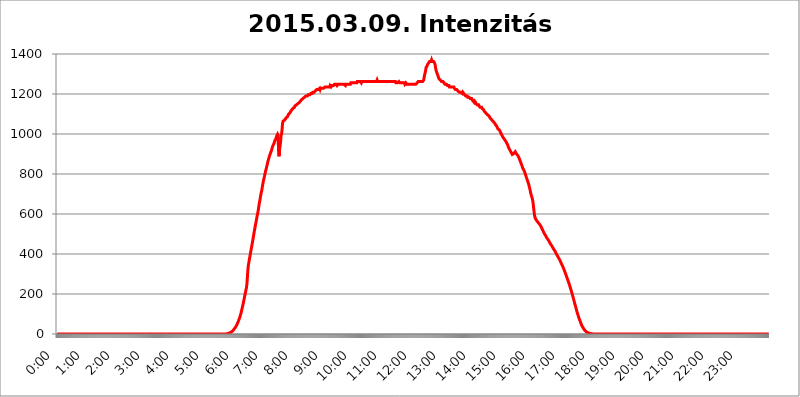
| Category | 2015.03.09. Intenzitás [W/m^2] |
|---|---|
| 0.0 | -0.256 |
| 0.0006944444444444445 | -0.256 |
| 0.001388888888888889 | -0.256 |
| 0.0020833333333333333 | -0.256 |
| 0.002777777777777778 | -0.256 |
| 0.003472222222222222 | -0.256 |
| 0.004166666666666667 | -0.256 |
| 0.004861111111111111 | -0.256 |
| 0.005555555555555556 | -0.256 |
| 0.0062499999999999995 | -0.256 |
| 0.006944444444444444 | -0.256 |
| 0.007638888888888889 | -0.256 |
| 0.008333333333333333 | -0.256 |
| 0.009027777777777779 | -0.256 |
| 0.009722222222222222 | -0.256 |
| 0.010416666666666666 | -0.256 |
| 0.011111111111111112 | -0.256 |
| 0.011805555555555555 | -0.256 |
| 0.012499999999999999 | -0.256 |
| 0.013194444444444444 | -0.256 |
| 0.013888888888888888 | -0.256 |
| 0.014583333333333332 | -0.256 |
| 0.015277777777777777 | -0.256 |
| 0.015972222222222224 | -0.256 |
| 0.016666666666666666 | -0.256 |
| 0.017361111111111112 | -0.256 |
| 0.018055555555555557 | -0.256 |
| 0.01875 | -0.256 |
| 0.019444444444444445 | -0.256 |
| 0.02013888888888889 | -0.256 |
| 0.020833333333333332 | -0.256 |
| 0.02152777777777778 | -0.256 |
| 0.022222222222222223 | -0.256 |
| 0.02291666666666667 | -0.256 |
| 0.02361111111111111 | -0.256 |
| 0.024305555555555556 | -0.256 |
| 0.024999999999999998 | -0.256 |
| 0.025694444444444447 | -0.256 |
| 0.02638888888888889 | -0.256 |
| 0.027083333333333334 | -0.256 |
| 0.027777777777777776 | -0.256 |
| 0.02847222222222222 | -0.256 |
| 0.029166666666666664 | -0.256 |
| 0.029861111111111113 | -0.256 |
| 0.030555555555555555 | -0.256 |
| 0.03125 | -0.256 |
| 0.03194444444444445 | -0.256 |
| 0.03263888888888889 | -0.256 |
| 0.03333333333333333 | -0.256 |
| 0.034027777777777775 | -0.256 |
| 0.034722222222222224 | -0.256 |
| 0.035416666666666666 | -0.256 |
| 0.036111111111111115 | -0.256 |
| 0.03680555555555556 | -0.256 |
| 0.0375 | -0.256 |
| 0.03819444444444444 | -0.256 |
| 0.03888888888888889 | -0.256 |
| 0.03958333333333333 | -0.256 |
| 0.04027777777777778 | -0.256 |
| 0.04097222222222222 | -0.256 |
| 0.041666666666666664 | -0.256 |
| 0.042361111111111106 | -0.256 |
| 0.04305555555555556 | -0.256 |
| 0.043750000000000004 | -0.256 |
| 0.044444444444444446 | -0.256 |
| 0.04513888888888889 | -0.256 |
| 0.04583333333333334 | -0.256 |
| 0.04652777777777778 | -0.256 |
| 0.04722222222222222 | -0.256 |
| 0.04791666666666666 | -0.256 |
| 0.04861111111111111 | -0.256 |
| 0.049305555555555554 | -0.256 |
| 0.049999999999999996 | -0.256 |
| 0.05069444444444445 | -0.256 |
| 0.051388888888888894 | -0.256 |
| 0.052083333333333336 | -0.256 |
| 0.05277777777777778 | -0.256 |
| 0.05347222222222222 | -0.256 |
| 0.05416666666666667 | -0.256 |
| 0.05486111111111111 | -0.256 |
| 0.05555555555555555 | -0.256 |
| 0.05625 | -0.256 |
| 0.05694444444444444 | -0.256 |
| 0.057638888888888885 | -0.256 |
| 0.05833333333333333 | -0.256 |
| 0.05902777777777778 | -0.256 |
| 0.059722222222222225 | -0.256 |
| 0.06041666666666667 | -0.256 |
| 0.061111111111111116 | -0.256 |
| 0.06180555555555556 | -0.256 |
| 0.0625 | -0.256 |
| 0.06319444444444444 | -0.256 |
| 0.06388888888888888 | -0.256 |
| 0.06458333333333334 | -0.256 |
| 0.06527777777777778 | -0.256 |
| 0.06597222222222222 | -0.256 |
| 0.06666666666666667 | -0.256 |
| 0.06736111111111111 | -0.256 |
| 0.06805555555555555 | -0.256 |
| 0.06874999999999999 | -0.256 |
| 0.06944444444444443 | -0.256 |
| 0.07013888888888889 | -0.256 |
| 0.07083333333333333 | -0.256 |
| 0.07152777777777779 | -0.256 |
| 0.07222222222222223 | -0.256 |
| 0.07291666666666667 | -0.256 |
| 0.07361111111111111 | -0.256 |
| 0.07430555555555556 | -0.256 |
| 0.075 | -0.256 |
| 0.07569444444444444 | -0.256 |
| 0.0763888888888889 | -0.256 |
| 0.07708333333333334 | -0.256 |
| 0.07777777777777778 | -0.256 |
| 0.07847222222222222 | -0.256 |
| 0.07916666666666666 | -0.256 |
| 0.0798611111111111 | -0.256 |
| 0.08055555555555556 | -0.256 |
| 0.08125 | -0.256 |
| 0.08194444444444444 | -0.256 |
| 0.08263888888888889 | -0.256 |
| 0.08333333333333333 | -0.256 |
| 0.08402777777777777 | -0.256 |
| 0.08472222222222221 | -0.256 |
| 0.08541666666666665 | -0.256 |
| 0.08611111111111112 | -0.256 |
| 0.08680555555555557 | -0.256 |
| 0.08750000000000001 | -0.256 |
| 0.08819444444444445 | -0.256 |
| 0.08888888888888889 | -0.256 |
| 0.08958333333333333 | -0.256 |
| 0.09027777777777778 | -0.256 |
| 0.09097222222222222 | -0.256 |
| 0.09166666666666667 | -0.256 |
| 0.09236111111111112 | -0.256 |
| 0.09305555555555556 | -0.256 |
| 0.09375 | -0.256 |
| 0.09444444444444444 | -0.256 |
| 0.09513888888888888 | -0.256 |
| 0.09583333333333333 | -0.256 |
| 0.09652777777777777 | -0.256 |
| 0.09722222222222222 | -0.256 |
| 0.09791666666666667 | -0.256 |
| 0.09861111111111111 | -0.256 |
| 0.09930555555555555 | -0.256 |
| 0.09999999999999999 | -0.256 |
| 0.10069444444444443 | -0.256 |
| 0.1013888888888889 | -0.256 |
| 0.10208333333333335 | -0.256 |
| 0.10277777777777779 | -0.256 |
| 0.10347222222222223 | -0.256 |
| 0.10416666666666667 | -0.256 |
| 0.10486111111111111 | -0.256 |
| 0.10555555555555556 | -0.256 |
| 0.10625 | -0.256 |
| 0.10694444444444444 | -0.256 |
| 0.1076388888888889 | -0.256 |
| 0.10833333333333334 | -0.256 |
| 0.10902777777777778 | -0.256 |
| 0.10972222222222222 | -0.256 |
| 0.1111111111111111 | -0.256 |
| 0.11180555555555556 | -0.256 |
| 0.11180555555555556 | -0.256 |
| 0.1125 | -0.256 |
| 0.11319444444444444 | -0.256 |
| 0.11388888888888889 | -0.256 |
| 0.11458333333333333 | -0.256 |
| 0.11527777777777777 | -0.256 |
| 0.11597222222222221 | -0.256 |
| 0.11666666666666665 | -0.256 |
| 0.1173611111111111 | -0.256 |
| 0.11805555555555557 | -0.256 |
| 0.11944444444444445 | -0.256 |
| 0.12013888888888889 | -0.256 |
| 0.12083333333333333 | -0.256 |
| 0.12152777777777778 | -0.256 |
| 0.12222222222222223 | -0.256 |
| 0.12291666666666667 | -0.256 |
| 0.12291666666666667 | -0.256 |
| 0.12361111111111112 | -0.256 |
| 0.12430555555555556 | -0.256 |
| 0.125 | -0.256 |
| 0.12569444444444444 | -0.256 |
| 0.12638888888888888 | -0.256 |
| 0.12708333333333333 | -0.256 |
| 0.16875 | -0.256 |
| 0.12847222222222224 | -0.256 |
| 0.12916666666666668 | -0.256 |
| 0.12986111111111112 | -0.256 |
| 0.13055555555555556 | -0.256 |
| 0.13125 | -0.256 |
| 0.13194444444444445 | -0.256 |
| 0.1326388888888889 | -0.256 |
| 0.13333333333333333 | -0.256 |
| 0.13402777777777777 | -0.256 |
| 0.13402777777777777 | -0.256 |
| 0.13472222222222222 | -0.256 |
| 0.13541666666666666 | -0.256 |
| 0.1361111111111111 | -0.256 |
| 0.13749999999999998 | -0.256 |
| 0.13819444444444443 | -0.256 |
| 0.1388888888888889 | -0.256 |
| 0.13958333333333334 | -0.256 |
| 0.14027777777777778 | -0.256 |
| 0.14097222222222222 | -0.256 |
| 0.14166666666666666 | -0.256 |
| 0.1423611111111111 | -0.256 |
| 0.14305555555555557 | -0.256 |
| 0.14375000000000002 | -0.256 |
| 0.14444444444444446 | -0.256 |
| 0.1451388888888889 | -0.256 |
| 0.1451388888888889 | -0.256 |
| 0.14652777777777778 | -0.256 |
| 0.14722222222222223 | -0.256 |
| 0.14791666666666667 | -0.256 |
| 0.1486111111111111 | -0.256 |
| 0.14930555555555555 | -0.256 |
| 0.15 | -0.256 |
| 0.15069444444444444 | -0.256 |
| 0.15138888888888888 | -0.256 |
| 0.15208333333333332 | -0.256 |
| 0.15277777777777776 | -0.256 |
| 0.15347222222222223 | -0.256 |
| 0.15416666666666667 | -0.256 |
| 0.15486111111111112 | -0.256 |
| 0.15555555555555556 | -0.256 |
| 0.15625 | -0.256 |
| 0.15694444444444444 | -0.256 |
| 0.15763888888888888 | -0.256 |
| 0.15833333333333333 | -0.256 |
| 0.15902777777777777 | -0.256 |
| 0.15972222222222224 | -0.256 |
| 0.16041666666666668 | -0.256 |
| 0.16111111111111112 | -0.256 |
| 0.16180555555555556 | -0.256 |
| 0.1625 | -0.256 |
| 0.16319444444444445 | -0.256 |
| 0.1638888888888889 | -0.256 |
| 0.16458333333333333 | -0.256 |
| 0.16527777777777777 | -0.256 |
| 0.16597222222222222 | -0.256 |
| 0.16666666666666666 | -0.256 |
| 0.1673611111111111 | -0.256 |
| 0.16805555555555554 | -0.256 |
| 0.16874999999999998 | -0.256 |
| 0.16944444444444443 | -0.256 |
| 0.17013888888888887 | -0.256 |
| 0.1708333333333333 | -0.256 |
| 0.17152777777777775 | -0.256 |
| 0.17222222222222225 | -0.256 |
| 0.1729166666666667 | -0.256 |
| 0.17361111111111113 | -0.256 |
| 0.17430555555555557 | -0.256 |
| 0.17500000000000002 | -0.256 |
| 0.17569444444444446 | -0.256 |
| 0.1763888888888889 | -0.256 |
| 0.17708333333333334 | -0.256 |
| 0.17777777777777778 | -0.256 |
| 0.17847222222222223 | -0.256 |
| 0.17916666666666667 | -0.256 |
| 0.1798611111111111 | -0.256 |
| 0.18055555555555555 | -0.256 |
| 0.18125 | -0.256 |
| 0.18194444444444444 | -0.256 |
| 0.1826388888888889 | -0.256 |
| 0.18333333333333335 | -0.256 |
| 0.1840277777777778 | -0.256 |
| 0.18472222222222223 | -0.256 |
| 0.18541666666666667 | -0.256 |
| 0.18611111111111112 | -0.256 |
| 0.18680555555555556 | -0.256 |
| 0.1875 | -0.256 |
| 0.18819444444444444 | -0.256 |
| 0.18888888888888888 | -0.256 |
| 0.18958333333333333 | -0.256 |
| 0.19027777777777777 | -0.256 |
| 0.1909722222222222 | -0.256 |
| 0.19166666666666665 | -0.256 |
| 0.19236111111111112 | -0.256 |
| 0.19305555555555554 | -0.256 |
| 0.19375 | -0.256 |
| 0.19444444444444445 | -0.256 |
| 0.1951388888888889 | -0.256 |
| 0.19583333333333333 | -0.256 |
| 0.19652777777777777 | -0.256 |
| 0.19722222222222222 | -0.256 |
| 0.19791666666666666 | -0.256 |
| 0.1986111111111111 | -0.256 |
| 0.19930555555555554 | -0.256 |
| 0.19999999999999998 | -0.256 |
| 0.20069444444444443 | -0.256 |
| 0.20138888888888887 | -0.256 |
| 0.2020833333333333 | -0.256 |
| 0.2027777777777778 | -0.256 |
| 0.2034722222222222 | -0.256 |
| 0.2041666666666667 | -0.256 |
| 0.20486111111111113 | -0.256 |
| 0.20555555555555557 | -0.256 |
| 0.20625000000000002 | -0.256 |
| 0.20694444444444446 | -0.256 |
| 0.2076388888888889 | -0.256 |
| 0.20833333333333334 | -0.256 |
| 0.20902777777777778 | -0.256 |
| 0.20972222222222223 | -0.256 |
| 0.21041666666666667 | -0.256 |
| 0.2111111111111111 | -0.256 |
| 0.21180555555555555 | -0.256 |
| 0.2125 | -0.256 |
| 0.21319444444444444 | -0.256 |
| 0.2138888888888889 | -0.256 |
| 0.21458333333333335 | -0.256 |
| 0.2152777777777778 | -0.256 |
| 0.21597222222222223 | -0.256 |
| 0.21666666666666667 | -0.256 |
| 0.21736111111111112 | -0.256 |
| 0.21805555555555556 | -0.256 |
| 0.21875 | -0.256 |
| 0.21944444444444444 | -0.256 |
| 0.22013888888888888 | -0.256 |
| 0.22083333333333333 | -0.256 |
| 0.22152777777777777 | -0.256 |
| 0.2222222222222222 | -0.256 |
| 0.22291666666666665 | -0.256 |
| 0.2236111111111111 | -0.256 |
| 0.22430555555555556 | -0.256 |
| 0.225 | -0.256 |
| 0.22569444444444445 | -0.256 |
| 0.2263888888888889 | -0.256 |
| 0.22708333333333333 | -0.256 |
| 0.22777777777777777 | -0.256 |
| 0.22847222222222222 | -0.256 |
| 0.22916666666666666 | -0.256 |
| 0.2298611111111111 | -0.256 |
| 0.23055555555555554 | -0.256 |
| 0.23124999999999998 | -0.256 |
| 0.23194444444444443 | -0.256 |
| 0.23263888888888887 | -0.256 |
| 0.2333333333333333 | -0.256 |
| 0.2340277777777778 | -0.256 |
| 0.2347222222222222 | -0.256 |
| 0.2354166666666667 | -0.256 |
| 0.23611111111111113 | -0.256 |
| 0.23680555555555557 | 1.09 |
| 0.23750000000000002 | 1.09 |
| 0.23819444444444446 | 1.09 |
| 0.2388888888888889 | 1.09 |
| 0.23958333333333334 | 2.439 |
| 0.24027777777777778 | 2.439 |
| 0.24097222222222223 | 3.791 |
| 0.24166666666666667 | 5.146 |
| 0.2423611111111111 | 6.503 |
| 0.24305555555555555 | 6.503 |
| 0.24375 | 9.225 |
| 0.24444444444444446 | 10.589 |
| 0.24513888888888888 | 11.956 |
| 0.24583333333333335 | 14.696 |
| 0.2465277777777778 | 17.444 |
| 0.24722222222222223 | 20.201 |
| 0.24791666666666667 | 22.965 |
| 0.24861111111111112 | 27.124 |
| 0.24930555555555556 | 29.905 |
| 0.25 | 34.086 |
| 0.25069444444444444 | 38.28 |
| 0.2513888888888889 | 42.483 |
| 0.2520833333333333 | 48.1 |
| 0.25277777777777777 | 53.73 |
| 0.2534722222222222 | 59.368 |
| 0.25416666666666665 | 65.012 |
| 0.2548611111111111 | 72.069 |
| 0.2555555555555556 | 79.125 |
| 0.25625000000000003 | 86.175 |
| 0.2569444444444445 | 94.617 |
| 0.2576388888888889 | 103.035 |
| 0.25833333333333336 | 114.207 |
| 0.2590277777777778 | 123.922 |
| 0.25972222222222224 | 134.943 |
| 0.2604166666666667 | 145.865 |
| 0.2611111111111111 | 158.022 |
| 0.26180555555555557 | 170.029 |
| 0.2625 | 181.877 |
| 0.26319444444444445 | 194.849 |
| 0.2638888888888889 | 206.348 |
| 0.26458333333333334 | 218.93 |
| 0.2652777777777778 | 230.083 |
| 0.2659722222222222 | 248.335 |
| 0.26666666666666666 | 283.803 |
| 0.2673611111111111 | 320.84 |
| 0.26805555555555555 | 344.144 |
| 0.26875 | 358.394 |
| 0.26944444444444443 | 372.972 |
| 0.2701388888888889 | 386.723 |
| 0.2708333333333333 | 400.943 |
| 0.27152777777777776 | 414.364 |
| 0.2722222222222222 | 428.341 |
| 0.27291666666666664 | 441.469 |
| 0.2736111111111111 | 455.184 |
| 0.2743055555555555 | 469.557 |
| 0.27499999999999997 | 484.662 |
| 0.27569444444444446 | 498.764 |
| 0.27638888888888885 | 513.561 |
| 0.27708333333333335 | 527.122 |
| 0.2777777777777778 | 541.298 |
| 0.27847222222222223 | 553.97 |
| 0.2791666666666667 | 567.15 |
| 0.2798611111111111 | 580.866 |
| 0.28055555555555556 | 595.145 |
| 0.28125 | 604.992 |
| 0.28194444444444444 | 620.273 |
| 0.2826388888888889 | 636.194 |
| 0.2833333333333333 | 652.786 |
| 0.28402777777777777 | 664.234 |
| 0.2847222222222222 | 678.997 |
| 0.28541666666666665 | 694.278 |
| 0.28611111111111115 | 706.89 |
| 0.28680555555555554 | 716.58 |
| 0.28750000000000003 | 733.184 |
| 0.2881944444444445 | 746.886 |
| 0.2888888888888889 | 760.972 |
| 0.28958333333333336 | 771.794 |
| 0.2902777777777778 | 782.842 |
| 0.29097222222222224 | 794.119 |
| 0.2916666666666667 | 805.632 |
| 0.2923611111111111 | 817.382 |
| 0.29305555555555557 | 825.351 |
| 0.29375 | 837.51 |
| 0.29444444444444445 | 845.755 |
| 0.2951388888888889 | 858.335 |
| 0.29583333333333334 | 862.585 |
| 0.2965277777777778 | 875.511 |
| 0.2972222222222222 | 884.274 |
| 0.29791666666666666 | 893.157 |
| 0.2986111111111111 | 897.643 |
| 0.29930555555555555 | 906.707 |
| 0.3 | 911.285 |
| 0.30069444444444443 | 920.533 |
| 0.3013888888888889 | 929.905 |
| 0.3020833333333333 | 934.639 |
| 0.30277777777777776 | 944.201 |
| 0.3034722222222222 | 949.03 |
| 0.30416666666666664 | 953.892 |
| 0.3048611111111111 | 963.712 |
| 0.3055555555555555 | 968.671 |
| 0.30624999999999997 | 973.663 |
| 0.3069444444444444 | 978.688 |
| 0.3076388888888889 | 988.839 |
| 0.30833333333333335 | 993.965 |
| 0.3090277777777778 | 999.125 |
| 0.30972222222222223 | 993.965 |
| 0.3104166666666667 | 915.893 |
| 0.3111111111111111 | 888.701 |
| 0.31180555555555556 | 920.533 |
| 0.3125 | 920.533 |
| 0.31319444444444444 | 958.785 |
| 0.3138888888888889 | 993.965 |
| 0.3145833333333333 | 999.125 |
| 0.31527777777777777 | 1020.106 |
| 0.3159722222222222 | 1052.625 |
| 0.31666666666666665 | 1063.751 |
| 0.31736111111111115 | 1063.751 |
| 0.31805555555555554 | 1063.751 |
| 0.31875000000000003 | 1069.368 |
| 0.3194444444444445 | 1069.368 |
| 0.3201388888888889 | 1075.021 |
| 0.32083333333333336 | 1080.711 |
| 0.3215277777777778 | 1080.711 |
| 0.32222222222222224 | 1080.711 |
| 0.3229166666666667 | 1086.439 |
| 0.3236111111111111 | 1092.203 |
| 0.32430555555555557 | 1098.004 |
| 0.325 | 1098.004 |
| 0.32569444444444445 | 1103.843 |
| 0.3263888888888889 | 1103.843 |
| 0.32708333333333334 | 1109.72 |
| 0.3277777777777778 | 1115.634 |
| 0.3284722222222222 | 1115.634 |
| 0.32916666666666666 | 1121.587 |
| 0.3298611111111111 | 1121.587 |
| 0.33055555555555555 | 1127.578 |
| 0.33125 | 1127.578 |
| 0.33194444444444443 | 1127.578 |
| 0.3326388888888889 | 1133.607 |
| 0.3333333333333333 | 1139.675 |
| 0.3340277777777778 | 1139.675 |
| 0.3347222222222222 | 1139.675 |
| 0.3354166666666667 | 1145.782 |
| 0.3361111111111111 | 1145.782 |
| 0.3368055555555556 | 1145.782 |
| 0.33749999999999997 | 1151.928 |
| 0.33819444444444446 | 1151.928 |
| 0.33888888888888885 | 1151.928 |
| 0.33958333333333335 | 1158.113 |
| 0.34027777777777773 | 1158.113 |
| 0.34097222222222223 | 1164.337 |
| 0.3416666666666666 | 1164.337 |
| 0.3423611111111111 | 1170.601 |
| 0.3430555555555555 | 1170.601 |
| 0.34375 | 1170.601 |
| 0.3444444444444445 | 1176.905 |
| 0.3451388888888889 | 1176.905 |
| 0.3458333333333334 | 1176.905 |
| 0.34652777777777777 | 1183.249 |
| 0.34722222222222227 | 1183.249 |
| 0.34791666666666665 | 1183.249 |
| 0.34861111111111115 | 1189.633 |
| 0.34930555555555554 | 1189.633 |
| 0.35000000000000003 | 1189.633 |
| 0.3506944444444444 | 1189.633 |
| 0.3513888888888889 | 1189.633 |
| 0.3520833333333333 | 1196.058 |
| 0.3527777777777778 | 1196.058 |
| 0.3534722222222222 | 1196.058 |
| 0.3541666666666667 | 1196.058 |
| 0.3548611111111111 | 1196.058 |
| 0.35555555555555557 | 1202.523 |
| 0.35625 | 1202.523 |
| 0.35694444444444445 | 1202.523 |
| 0.3576388888888889 | 1202.523 |
| 0.35833333333333334 | 1209.029 |
| 0.3590277777777778 | 1209.029 |
| 0.3597222222222222 | 1209.029 |
| 0.36041666666666666 | 1209.029 |
| 0.3611111111111111 | 1209.029 |
| 0.36180555555555555 | 1215.576 |
| 0.3625 | 1215.576 |
| 0.36319444444444443 | 1215.576 |
| 0.3638888888888889 | 1222.164 |
| 0.3645833333333333 | 1222.164 |
| 0.3652777777777778 | 1222.164 |
| 0.3659722222222222 | 1222.164 |
| 0.3666666666666667 | 1222.164 |
| 0.3673611111111111 | 1222.164 |
| 0.3680555555555556 | 1228.794 |
| 0.36874999999999997 | 1222.164 |
| 0.36944444444444446 | 1228.794 |
| 0.37013888888888885 | 1228.794 |
| 0.37083333333333335 | 1228.794 |
| 0.37152777777777773 | 1228.794 |
| 0.37222222222222223 | 1228.794 |
| 0.3729166666666666 | 1228.794 |
| 0.3736111111111111 | 1228.794 |
| 0.3743055555555555 | 1228.794 |
| 0.375 | 1228.794 |
| 0.3756944444444445 | 1235.465 |
| 0.3763888888888889 | 1235.465 |
| 0.3770833333333334 | 1235.465 |
| 0.37777777777777777 | 1235.465 |
| 0.37847222222222227 | 1235.465 |
| 0.37916666666666665 | 1235.465 |
| 0.37986111111111115 | 1235.465 |
| 0.38055555555555554 | 1235.465 |
| 0.38125000000000003 | 1235.465 |
| 0.3819444444444444 | 1235.465 |
| 0.3826388888888889 | 1242.179 |
| 0.3833333333333333 | 1242.179 |
| 0.3840277777777778 | 1235.465 |
| 0.3847222222222222 | 1235.465 |
| 0.3854166666666667 | 1242.179 |
| 0.3861111111111111 | 1242.179 |
| 0.38680555555555557 | 1242.179 |
| 0.3875 | 1242.179 |
| 0.38819444444444445 | 1242.179 |
| 0.3888888888888889 | 1248.934 |
| 0.38958333333333334 | 1248.934 |
| 0.3902777777777778 | 1248.934 |
| 0.3909722222222222 | 1248.934 |
| 0.39166666666666666 | 1248.934 |
| 0.3923611111111111 | 1242.179 |
| 0.39305555555555555 | 1242.179 |
| 0.39375 | 1248.934 |
| 0.39444444444444443 | 1248.934 |
| 0.3951388888888889 | 1248.934 |
| 0.3958333333333333 | 1248.934 |
| 0.3965277777777778 | 1248.934 |
| 0.3972222222222222 | 1248.934 |
| 0.3979166666666667 | 1248.934 |
| 0.3986111111111111 | 1248.934 |
| 0.3993055555555556 | 1248.934 |
| 0.39999999999999997 | 1248.934 |
| 0.40069444444444446 | 1248.934 |
| 0.40138888888888885 | 1248.934 |
| 0.40208333333333335 | 1248.934 |
| 0.40277777777777773 | 1248.934 |
| 0.40347222222222223 | 1248.934 |
| 0.4041666666666666 | 1242.179 |
| 0.4048611111111111 | 1248.934 |
| 0.4055555555555555 | 1248.934 |
| 0.40625 | 1248.934 |
| 0.4069444444444445 | 1248.934 |
| 0.4076388888888889 | 1248.934 |
| 0.4083333333333334 | 1248.934 |
| 0.40902777777777777 | 1248.934 |
| 0.40972222222222227 | 1248.934 |
| 0.41041666666666665 | 1248.934 |
| 0.41111111111111115 | 1248.934 |
| 0.41180555555555554 | 1255.731 |
| 0.41250000000000003 | 1255.731 |
| 0.4131944444444444 | 1255.731 |
| 0.4138888888888889 | 1255.731 |
| 0.4145833333333333 | 1255.731 |
| 0.4152777777777778 | 1255.731 |
| 0.4159722222222222 | 1255.731 |
| 0.4166666666666667 | 1255.731 |
| 0.4173611111111111 | 1255.731 |
| 0.41805555555555557 | 1255.731 |
| 0.41875 | 1255.731 |
| 0.41944444444444445 | 1255.731 |
| 0.4201388888888889 | 1255.731 |
| 0.42083333333333334 | 1262.571 |
| 0.4215277777777778 | 1262.571 |
| 0.4222222222222222 | 1262.571 |
| 0.42291666666666666 | 1262.571 |
| 0.4236111111111111 | 1262.571 |
| 0.42430555555555555 | 1262.571 |
| 0.425 | 1262.571 |
| 0.42569444444444443 | 1262.571 |
| 0.4263888888888889 | 1255.731 |
| 0.4270833333333333 | 1262.571 |
| 0.4277777777777778 | 1262.571 |
| 0.4284722222222222 | 1262.571 |
| 0.4291666666666667 | 1262.571 |
| 0.4298611111111111 | 1262.571 |
| 0.4305555555555556 | 1262.571 |
| 0.43124999999999997 | 1262.571 |
| 0.43194444444444446 | 1262.571 |
| 0.43263888888888885 | 1262.571 |
| 0.43333333333333335 | 1262.571 |
| 0.43402777777777773 | 1262.571 |
| 0.43472222222222223 | 1262.571 |
| 0.4354166666666666 | 1262.571 |
| 0.4361111111111111 | 1262.571 |
| 0.4368055555555555 | 1262.571 |
| 0.4375 | 1262.571 |
| 0.4381944444444445 | 1262.571 |
| 0.4388888888888889 | 1262.571 |
| 0.4395833333333334 | 1262.571 |
| 0.44027777777777777 | 1262.571 |
| 0.44097222222222227 | 1262.571 |
| 0.44166666666666665 | 1262.571 |
| 0.44236111111111115 | 1262.571 |
| 0.44305555555555554 | 1262.571 |
| 0.44375000000000003 | 1262.571 |
| 0.4444444444444444 | 1262.571 |
| 0.4451388888888889 | 1262.571 |
| 0.4458333333333333 | 1262.571 |
| 0.4465277777777778 | 1262.571 |
| 0.4472222222222222 | 1262.571 |
| 0.4479166666666667 | 1262.571 |
| 0.4486111111111111 | 1269.454 |
| 0.44930555555555557 | 1262.571 |
| 0.45 | 1262.571 |
| 0.45069444444444445 | 1262.571 |
| 0.4513888888888889 | 1262.571 |
| 0.45208333333333334 | 1262.571 |
| 0.4527777777777778 | 1262.571 |
| 0.4534722222222222 | 1262.571 |
| 0.45416666666666666 | 1262.571 |
| 0.4548611111111111 | 1262.571 |
| 0.45555555555555555 | 1262.571 |
| 0.45625 | 1262.571 |
| 0.45694444444444443 | 1262.571 |
| 0.4576388888888889 | 1262.571 |
| 0.4583333333333333 | 1262.571 |
| 0.4590277777777778 | 1262.571 |
| 0.4597222222222222 | 1262.571 |
| 0.4604166666666667 | 1262.571 |
| 0.4611111111111111 | 1262.571 |
| 0.4618055555555556 | 1262.571 |
| 0.46249999999999997 | 1262.571 |
| 0.46319444444444446 | 1262.571 |
| 0.46388888888888885 | 1262.571 |
| 0.46458333333333335 | 1262.571 |
| 0.46527777777777773 | 1262.571 |
| 0.46597222222222223 | 1262.571 |
| 0.4666666666666666 | 1262.571 |
| 0.4673611111111111 | 1262.571 |
| 0.4680555555555555 | 1262.571 |
| 0.46875 | 1262.571 |
| 0.4694444444444445 | 1262.571 |
| 0.4701388888888889 | 1262.571 |
| 0.4708333333333334 | 1262.571 |
| 0.47152777777777777 | 1262.571 |
| 0.47222222222222227 | 1262.571 |
| 0.47291666666666665 | 1262.571 |
| 0.47361111111111115 | 1262.571 |
| 0.47430555555555554 | 1262.571 |
| 0.47500000000000003 | 1255.731 |
| 0.4756944444444444 | 1255.731 |
| 0.4763888888888889 | 1255.731 |
| 0.4770833333333333 | 1255.731 |
| 0.4777777777777778 | 1255.731 |
| 0.4784722222222222 | 1255.731 |
| 0.4791666666666667 | 1262.571 |
| 0.4798611111111111 | 1262.571 |
| 0.48055555555555557 | 1255.731 |
| 0.48125 | 1255.731 |
| 0.48194444444444445 | 1255.731 |
| 0.4826388888888889 | 1255.731 |
| 0.48333333333333334 | 1255.731 |
| 0.4840277777777778 | 1255.731 |
| 0.4847222222222222 | 1255.731 |
| 0.48541666666666666 | 1255.731 |
| 0.4861111111111111 | 1255.731 |
| 0.48680555555555555 | 1255.731 |
| 0.4875 | 1248.934 |
| 0.48819444444444443 | 1248.934 |
| 0.4888888888888889 | 1255.731 |
| 0.4895833333333333 | 1255.731 |
| 0.4902777777777778 | 1248.934 |
| 0.4909722222222222 | 1248.934 |
| 0.4916666666666667 | 1248.934 |
| 0.4923611111111111 | 1248.934 |
| 0.4930555555555556 | 1248.934 |
| 0.49374999999999997 | 1248.934 |
| 0.49444444444444446 | 1248.934 |
| 0.49513888888888885 | 1248.934 |
| 0.49583333333333335 | 1248.934 |
| 0.49652777777777773 | 1248.934 |
| 0.49722222222222223 | 1248.934 |
| 0.4979166666666666 | 1248.934 |
| 0.4986111111111111 | 1248.934 |
| 0.4993055555555555 | 1248.934 |
| 0.5 | 1248.934 |
| 0.5006944444444444 | 1248.934 |
| 0.5013888888888889 | 1248.934 |
| 0.5020833333333333 | 1248.934 |
| 0.5027777777777778 | 1248.934 |
| 0.5034722222222222 | 1248.934 |
| 0.5041666666666667 | 1248.934 |
| 0.5048611111111111 | 1255.731 |
| 0.5055555555555555 | 1255.731 |
| 0.50625 | 1262.571 |
| 0.5069444444444444 | 1262.571 |
| 0.5076388888888889 | 1262.571 |
| 0.5083333333333333 | 1262.571 |
| 0.5090277777777777 | 1262.571 |
| 0.5097222222222222 | 1262.571 |
| 0.5104166666666666 | 1262.571 |
| 0.5111111111111112 | 1262.571 |
| 0.5118055555555555 | 1262.571 |
| 0.5125000000000001 | 1262.571 |
| 0.5131944444444444 | 1262.571 |
| 0.513888888888889 | 1269.454 |
| 0.5145833333333333 | 1283.348 |
| 0.5152777777777778 | 1297.416 |
| 0.5159722222222222 | 1304.515 |
| 0.5166666666666667 | 1318.845 |
| 0.517361111111111 | 1333.352 |
| 0.5180555555555556 | 1333.352 |
| 0.5187499999999999 | 1340.673 |
| 0.5194444444444445 | 1348.039 |
| 0.5201388888888888 | 1348.039 |
| 0.5208333333333334 | 1355.45 |
| 0.5215277777777778 | 1355.45 |
| 0.5222222222222223 | 1362.906 |
| 0.5229166666666667 | 1362.906 |
| 0.5236111111111111 | 1362.906 |
| 0.5243055555555556 | 1362.906 |
| 0.525 | 1370.408 |
| 0.5256944444444445 | 1362.906 |
| 0.5263888888888889 | 1362.906 |
| 0.5270833333333333 | 1362.906 |
| 0.5277777777777778 | 1362.906 |
| 0.5284722222222222 | 1362.906 |
| 0.5291666666666667 | 1355.45 |
| 0.5298611111111111 | 1348.039 |
| 0.5305555555555556 | 1333.352 |
| 0.53125 | 1318.845 |
| 0.5319444444444444 | 1311.658 |
| 0.5326388888888889 | 1304.515 |
| 0.5333333333333333 | 1297.416 |
| 0.5340277777777778 | 1290.36 |
| 0.5347222222222222 | 1283.348 |
| 0.5354166666666667 | 1276.38 |
| 0.5361111111111111 | 1276.38 |
| 0.5368055555555555 | 1276.38 |
| 0.5375 | 1269.454 |
| 0.5381944444444444 | 1269.454 |
| 0.5388888888888889 | 1262.571 |
| 0.5395833333333333 | 1262.571 |
| 0.5402777777777777 | 1262.571 |
| 0.5409722222222222 | 1262.571 |
| 0.5416666666666666 | 1262.571 |
| 0.5423611111111112 | 1255.731 |
| 0.5430555555555555 | 1255.731 |
| 0.5437500000000001 | 1248.934 |
| 0.5444444444444444 | 1248.934 |
| 0.545138888888889 | 1248.934 |
| 0.5458333333333333 | 1248.934 |
| 0.5465277777777778 | 1248.934 |
| 0.5472222222222222 | 1242.179 |
| 0.5479166666666667 | 1242.179 |
| 0.548611111111111 | 1242.179 |
| 0.5493055555555556 | 1242.179 |
| 0.5499999999999999 | 1235.465 |
| 0.5506944444444445 | 1235.465 |
| 0.5513888888888888 | 1235.465 |
| 0.5520833333333334 | 1235.465 |
| 0.5527777777777778 | 1235.465 |
| 0.5534722222222223 | 1235.465 |
| 0.5541666666666667 | 1235.465 |
| 0.5548611111111111 | 1235.465 |
| 0.5555555555555556 | 1235.465 |
| 0.55625 | 1235.465 |
| 0.5569444444444445 | 1228.794 |
| 0.5576388888888889 | 1228.794 |
| 0.5583333333333333 | 1222.164 |
| 0.5590277777777778 | 1222.164 |
| 0.5597222222222222 | 1222.164 |
| 0.5604166666666667 | 1222.164 |
| 0.5611111111111111 | 1222.164 |
| 0.5618055555555556 | 1215.576 |
| 0.5625 | 1215.576 |
| 0.5631944444444444 | 1215.576 |
| 0.5638888888888889 | 1209.029 |
| 0.5645833333333333 | 1209.029 |
| 0.5652777777777778 | 1209.029 |
| 0.5659722222222222 | 1209.029 |
| 0.5666666666666667 | 1209.029 |
| 0.5673611111111111 | 1209.029 |
| 0.5680555555555555 | 1202.523 |
| 0.56875 | 1209.029 |
| 0.5694444444444444 | 1209.029 |
| 0.5701388888888889 | 1202.523 |
| 0.5708333333333333 | 1202.523 |
| 0.5715277777777777 | 1196.058 |
| 0.5722222222222222 | 1196.058 |
| 0.5729166666666666 | 1189.633 |
| 0.5736111111111112 | 1189.633 |
| 0.5743055555555555 | 1189.633 |
| 0.5750000000000001 | 1189.633 |
| 0.5756944444444444 | 1183.249 |
| 0.576388888888889 | 1183.249 |
| 0.5770833333333333 | 1183.249 |
| 0.5777777777777778 | 1183.249 |
| 0.5784722222222222 | 1183.249 |
| 0.5791666666666667 | 1176.905 |
| 0.579861111111111 | 1176.905 |
| 0.5805555555555556 | 1176.905 |
| 0.5812499999999999 | 1176.905 |
| 0.5819444444444445 | 1170.601 |
| 0.5826388888888888 | 1170.601 |
| 0.5833333333333334 | 1164.337 |
| 0.5840277777777778 | 1164.337 |
| 0.5847222222222223 | 1158.113 |
| 0.5854166666666667 | 1164.337 |
| 0.5861111111111111 | 1164.337 |
| 0.5868055555555556 | 1158.113 |
| 0.5875 | 1151.928 |
| 0.5881944444444445 | 1151.928 |
| 0.5888888888888889 | 1145.782 |
| 0.5895833333333333 | 1145.782 |
| 0.5902777777777778 | 1145.782 |
| 0.5909722222222222 | 1145.782 |
| 0.5916666666666667 | 1139.675 |
| 0.5923611111111111 | 1139.675 |
| 0.5930555555555556 | 1133.607 |
| 0.59375 | 1133.607 |
| 0.5944444444444444 | 1133.607 |
| 0.5951388888888889 | 1133.607 |
| 0.5958333333333333 | 1127.578 |
| 0.5965277777777778 | 1127.578 |
| 0.5972222222222222 | 1127.578 |
| 0.5979166666666667 | 1121.587 |
| 0.5986111111111111 | 1115.634 |
| 0.5993055555555555 | 1115.634 |
| 0.6 | 1109.72 |
| 0.6006944444444444 | 1109.72 |
| 0.6013888888888889 | 1103.843 |
| 0.6020833333333333 | 1103.843 |
| 0.6027777777777777 | 1098.004 |
| 0.6034722222222222 | 1098.004 |
| 0.6041666666666666 | 1098.004 |
| 0.6048611111111112 | 1092.203 |
| 0.6055555555555555 | 1092.203 |
| 0.6062500000000001 | 1086.439 |
| 0.6069444444444444 | 1080.711 |
| 0.607638888888889 | 1080.711 |
| 0.6083333333333333 | 1075.021 |
| 0.6090277777777778 | 1075.021 |
| 0.6097222222222222 | 1069.368 |
| 0.6104166666666667 | 1069.368 |
| 0.611111111111111 | 1063.751 |
| 0.6118055555555556 | 1063.751 |
| 0.6124999999999999 | 1058.17 |
| 0.6131944444444445 | 1058.17 |
| 0.6138888888888888 | 1052.625 |
| 0.6145833333333334 | 1047.117 |
| 0.6152777777777778 | 1047.117 |
| 0.6159722222222223 | 1041.644 |
| 0.6166666666666667 | 1036.206 |
| 0.6173611111111111 | 1030.804 |
| 0.6180555555555556 | 1025.437 |
| 0.61875 | 1025.437 |
| 0.6194444444444445 | 1025.437 |
| 0.6201388888888889 | 1020.106 |
| 0.6208333333333333 | 1014.809 |
| 0.6215277777777778 | 1009.546 |
| 0.6222222222222222 | 1004.318 |
| 0.6229166666666667 | 999.125 |
| 0.6236111111111111 | 993.965 |
| 0.6243055555555556 | 988.839 |
| 0.625 | 983.747 |
| 0.6256944444444444 | 983.747 |
| 0.6263888888888889 | 978.688 |
| 0.6270833333333333 | 973.663 |
| 0.6277777777777778 | 973.663 |
| 0.6284722222222222 | 968.671 |
| 0.6291666666666667 | 963.712 |
| 0.6298611111111111 | 958.785 |
| 0.6305555555555555 | 953.892 |
| 0.63125 | 949.03 |
| 0.6319444444444444 | 944.201 |
| 0.6326388888888889 | 934.639 |
| 0.6333333333333333 | 929.905 |
| 0.6340277777777777 | 925.203 |
| 0.6347222222222222 | 925.203 |
| 0.6354166666666666 | 915.893 |
| 0.6361111111111112 | 911.285 |
| 0.6368055555555555 | 906.707 |
| 0.6375000000000001 | 902.16 |
| 0.6381944444444444 | 897.643 |
| 0.638888888888889 | 897.643 |
| 0.6395833333333333 | 902.16 |
| 0.6402777777777778 | 902.16 |
| 0.6409722222222222 | 906.707 |
| 0.6416666666666667 | 906.707 |
| 0.642361111111111 | 911.285 |
| 0.6430555555555556 | 906.707 |
| 0.6437499999999999 | 902.16 |
| 0.6444444444444445 | 902.16 |
| 0.6451388888888888 | 897.643 |
| 0.6458333333333334 | 893.157 |
| 0.6465277777777778 | 888.701 |
| 0.6472222222222223 | 884.274 |
| 0.6479166666666667 | 879.878 |
| 0.6486111111111111 | 871.173 |
| 0.6493055555555556 | 866.865 |
| 0.65 | 858.335 |
| 0.6506944444444445 | 854.113 |
| 0.6513888888888889 | 845.755 |
| 0.6520833333333333 | 837.51 |
| 0.6527777777777778 | 829.377 |
| 0.6534722222222222 | 825.351 |
| 0.6541666666666667 | 821.353 |
| 0.6548611111111111 | 817.382 |
| 0.6555555555555556 | 809.522 |
| 0.65625 | 801.768 |
| 0.6569444444444444 | 794.119 |
| 0.6576388888888889 | 790.334 |
| 0.6583333333333333 | 779.134 |
| 0.6590277777777778 | 771.794 |
| 0.6597222222222222 | 764.555 |
| 0.6604166666666667 | 757.414 |
| 0.6611111111111111 | 750.371 |
| 0.6618055555555555 | 739.988 |
| 0.6625 | 729.817 |
| 0.6631944444444444 | 719.855 |
| 0.6638888888888889 | 706.89 |
| 0.6645833333333333 | 697.399 |
| 0.6652777777777777 | 688.102 |
| 0.6659722222222222 | 682.011 |
| 0.6666666666666666 | 670.078 |
| 0.6673611111111111 | 655.618 |
| 0.6680555555555556 | 633.495 |
| 0.6687500000000001 | 612.554 |
| 0.6694444444444444 | 592.725 |
| 0.6701388888888888 | 580.866 |
| 0.6708333333333334 | 576.233 |
| 0.6715277777777778 | 571.661 |
| 0.6722222222222222 | 569.398 |
| 0.6729166666666666 | 564.917 |
| 0.6736111111111112 | 560.495 |
| 0.6743055555555556 | 558.305 |
| 0.6749999999999999 | 556.131 |
| 0.6756944444444444 | 551.823 |
| 0.6763888888888889 | 549.691 |
| 0.6770833333333334 | 545.467 |
| 0.6777777777777777 | 541.298 |
| 0.6784722222222223 | 537.182 |
| 0.6791666666666667 | 533.12 |
| 0.6798611111111111 | 527.122 |
| 0.6805555555555555 | 521.237 |
| 0.68125 | 517.375 |
| 0.6819444444444445 | 511.671 |
| 0.6826388888888889 | 506.072 |
| 0.6833333333333332 | 500.575 |
| 0.6840277777777778 | 496.965 |
| 0.6847222222222222 | 493.398 |
| 0.6854166666666667 | 488.126 |
| 0.686111111111111 | 484.662 |
| 0.6868055555555556 | 479.541 |
| 0.6875 | 476.176 |
| 0.6881944444444444 | 472.848 |
| 0.688888888888889 | 467.925 |
| 0.6895833333333333 | 464.688 |
| 0.6902777777777778 | 459.898 |
| 0.6909722222222222 | 455.184 |
| 0.6916666666666668 | 452.082 |
| 0.6923611111111111 | 447.487 |
| 0.6930555555555555 | 442.962 |
| 0.69375 | 439.982 |
| 0.6944444444444445 | 435.566 |
| 0.6951388888888889 | 431.211 |
| 0.6958333333333333 | 428.341 |
| 0.6965277777777777 | 422.678 |
| 0.6972222222222223 | 419.883 |
| 0.6979166666666666 | 415.735 |
| 0.6986111111111111 | 411.638 |
| 0.6993055555555556 | 406.25 |
| 0.7000000000000001 | 400.943 |
| 0.7006944444444444 | 397.012 |
| 0.7013888888888888 | 391.834 |
| 0.7020833333333334 | 387.995 |
| 0.7027777777777778 | 382.93 |
| 0.7034722222222222 | 379.171 |
| 0.7041666666666666 | 374.206 |
| 0.7048611111111112 | 369.291 |
| 0.7055555555555556 | 364.422 |
| 0.7062499999999999 | 358.394 |
| 0.7069444444444444 | 353.613 |
| 0.7076388888888889 | 347.682 |
| 0.7083333333333334 | 342.968 |
| 0.7090277777777777 | 337.109 |
| 0.7097222222222223 | 331.279 |
| 0.7104166666666667 | 325.473 |
| 0.7111111111111111 | 318.527 |
| 0.7118055555555555 | 312.749 |
| 0.7125 | 305.819 |
| 0.7131944444444445 | 298.885 |
| 0.7138888888888889 | 291.937 |
| 0.7145833333333332 | 284.967 |
| 0.7152777777777778 | 277.967 |
| 0.7159722222222222 | 270.931 |
| 0.7166666666666667 | 263.851 |
| 0.717361111111111 | 256.722 |
| 0.7180555555555556 | 249.538 |
| 0.71875 | 242.296 |
| 0.7194444444444444 | 233.766 |
| 0.720138888888889 | 225.146 |
| 0.7208333333333333 | 217.681 |
| 0.7215277777777778 | 208.881 |
| 0.7222222222222222 | 199.98 |
| 0.7229166666666668 | 190.979 |
| 0.7236111111111111 | 181.877 |
| 0.7243055555555555 | 172.676 |
| 0.725 | 163.378 |
| 0.7256944444444445 | 153.986 |
| 0.7263888888888889 | 144.506 |
| 0.7270833333333333 | 136.314 |
| 0.7277777777777777 | 126.685 |
| 0.7284722222222223 | 116.989 |
| 0.7291666666666666 | 108.629 |
| 0.7298611111111111 | 100.233 |
| 0.7305555555555556 | 93.212 |
| 0.7312500000000001 | 84.766 |
| 0.7319444444444444 | 77.715 |
| 0.7326388888888888 | 70.658 |
| 0.7333333333333334 | 65.012 |
| 0.7340277777777778 | 57.958 |
| 0.7347222222222222 | 50.914 |
| 0.7354166666666666 | 45.29 |
| 0.7361111111111112 | 39.68 |
| 0.7368055555555556 | 35.483 |
| 0.7374999999999999 | 31.297 |
| 0.7381944444444444 | 27.124 |
| 0.7388888888888889 | 22.965 |
| 0.7395833333333334 | 20.201 |
| 0.7402777777777777 | 17.444 |
| 0.7409722222222223 | 14.696 |
| 0.7416666666666667 | 11.956 |
| 0.7423611111111111 | 10.589 |
| 0.7430555555555555 | 9.225 |
| 0.74375 | 7.862 |
| 0.7444444444444445 | 6.503 |
| 0.7451388888888889 | 5.146 |
| 0.7458333333333332 | 3.791 |
| 0.7465277777777778 | 3.791 |
| 0.7472222222222222 | 2.439 |
| 0.7479166666666667 | 2.439 |
| 0.748611111111111 | 1.09 |
| 0.7493055555555556 | 1.09 |
| 0.75 | 1.09 |
| 0.7506944444444444 | 1.09 |
| 0.751388888888889 | 1.09 |
| 0.7520833333333333 | -0.256 |
| 0.7527777777777778 | -0.256 |
| 0.7534722222222222 | -0.256 |
| 0.7541666666666668 | -0.256 |
| 0.7548611111111111 | -0.256 |
| 0.7555555555555555 | -0.256 |
| 0.75625 | -0.256 |
| 0.7569444444444445 | -0.256 |
| 0.7576388888888889 | -0.256 |
| 0.7583333333333333 | -0.256 |
| 0.7590277777777777 | -0.256 |
| 0.7597222222222223 | -0.256 |
| 0.7604166666666666 | -0.256 |
| 0.7611111111111111 | -0.256 |
| 0.7618055555555556 | -0.256 |
| 0.7625000000000001 | -0.256 |
| 0.7631944444444444 | -0.256 |
| 0.7638888888888888 | -0.256 |
| 0.7645833333333334 | -0.256 |
| 0.7652777777777778 | -0.256 |
| 0.7659722222222222 | -0.256 |
| 0.7666666666666666 | -0.256 |
| 0.7673611111111112 | -0.256 |
| 0.7680555555555556 | -0.256 |
| 0.7687499999999999 | -0.256 |
| 0.7694444444444444 | -0.256 |
| 0.7701388888888889 | -0.256 |
| 0.7708333333333334 | -0.256 |
| 0.7715277777777777 | -0.256 |
| 0.7722222222222223 | -0.256 |
| 0.7729166666666667 | -0.256 |
| 0.7736111111111111 | -0.256 |
| 0.7743055555555555 | -0.256 |
| 0.775 | -0.256 |
| 0.7756944444444445 | -0.256 |
| 0.7763888888888889 | -0.256 |
| 0.7770833333333332 | -0.256 |
| 0.7777777777777778 | -0.256 |
| 0.7784722222222222 | -0.256 |
| 0.7791666666666667 | -0.256 |
| 0.779861111111111 | -0.256 |
| 0.7805555555555556 | -0.256 |
| 0.78125 | -0.256 |
| 0.7819444444444444 | -0.256 |
| 0.782638888888889 | -0.256 |
| 0.7833333333333333 | -0.256 |
| 0.7840277777777778 | -0.256 |
| 0.7847222222222222 | -0.256 |
| 0.7854166666666668 | -0.256 |
| 0.7861111111111111 | -0.256 |
| 0.7868055555555555 | -0.256 |
| 0.7875 | -0.256 |
| 0.7881944444444445 | -0.256 |
| 0.7888888888888889 | -0.256 |
| 0.7895833333333333 | -0.256 |
| 0.7902777777777777 | -0.256 |
| 0.7909722222222223 | -0.256 |
| 0.7916666666666666 | -0.256 |
| 0.7923611111111111 | -0.256 |
| 0.7930555555555556 | -0.256 |
| 0.7937500000000001 | -0.256 |
| 0.7944444444444444 | -0.256 |
| 0.7951388888888888 | -0.256 |
| 0.7958333333333334 | -0.256 |
| 0.7965277777777778 | -0.256 |
| 0.7972222222222222 | -0.256 |
| 0.7979166666666666 | -0.256 |
| 0.7986111111111112 | -0.256 |
| 0.7993055555555556 | -0.256 |
| 0.7999999999999999 | -0.256 |
| 0.8006944444444444 | -0.256 |
| 0.8013888888888889 | -0.256 |
| 0.8020833333333334 | -0.256 |
| 0.8027777777777777 | -0.256 |
| 0.8034722222222223 | -0.256 |
| 0.8041666666666667 | -0.256 |
| 0.8048611111111111 | -0.256 |
| 0.8055555555555555 | -0.256 |
| 0.80625 | -0.256 |
| 0.8069444444444445 | -0.256 |
| 0.8076388888888889 | -0.256 |
| 0.8083333333333332 | -0.256 |
| 0.8090277777777778 | -0.256 |
| 0.8097222222222222 | -0.256 |
| 0.8104166666666667 | -0.256 |
| 0.811111111111111 | -0.256 |
| 0.8118055555555556 | -0.256 |
| 0.8125 | -0.256 |
| 0.8131944444444444 | -0.256 |
| 0.813888888888889 | -0.256 |
| 0.8145833333333333 | -0.256 |
| 0.8152777777777778 | -0.256 |
| 0.8159722222222222 | -0.256 |
| 0.8166666666666668 | -0.256 |
| 0.8173611111111111 | -0.256 |
| 0.8180555555555555 | -0.256 |
| 0.81875 | -0.256 |
| 0.8194444444444445 | -0.256 |
| 0.8201388888888889 | -0.256 |
| 0.8208333333333333 | -0.256 |
| 0.8215277777777777 | -0.256 |
| 0.8222222222222223 | -0.256 |
| 0.8229166666666666 | -0.256 |
| 0.8236111111111111 | -0.256 |
| 0.8243055555555556 | -0.256 |
| 0.8250000000000001 | -0.256 |
| 0.8256944444444444 | -0.256 |
| 0.8263888888888888 | -0.256 |
| 0.8270833333333334 | -0.256 |
| 0.8277777777777778 | -0.256 |
| 0.8284722222222222 | -0.256 |
| 0.8291666666666666 | -0.256 |
| 0.8298611111111112 | -0.256 |
| 0.8305555555555556 | -0.256 |
| 0.8312499999999999 | -0.256 |
| 0.8319444444444444 | -0.256 |
| 0.8326388888888889 | -0.256 |
| 0.8333333333333334 | -0.256 |
| 0.8340277777777777 | -0.256 |
| 0.8347222222222223 | -0.256 |
| 0.8354166666666667 | -0.256 |
| 0.8361111111111111 | -0.256 |
| 0.8368055555555555 | -0.256 |
| 0.8375 | -0.256 |
| 0.8381944444444445 | -0.256 |
| 0.8388888888888889 | -0.256 |
| 0.8395833333333332 | -0.256 |
| 0.8402777777777778 | -0.256 |
| 0.8409722222222222 | -0.256 |
| 0.8416666666666667 | -0.256 |
| 0.842361111111111 | -0.256 |
| 0.8430555555555556 | -0.256 |
| 0.84375 | -0.256 |
| 0.8444444444444444 | -0.256 |
| 0.845138888888889 | -0.256 |
| 0.8458333333333333 | -0.256 |
| 0.8465277777777778 | -0.256 |
| 0.8472222222222222 | -0.256 |
| 0.8479166666666668 | -0.256 |
| 0.8486111111111111 | -0.256 |
| 0.8493055555555555 | -0.256 |
| 0.85 | -0.256 |
| 0.8506944444444445 | -0.256 |
| 0.8513888888888889 | -0.256 |
| 0.8520833333333333 | -0.256 |
| 0.8527777777777777 | -0.256 |
| 0.8534722222222223 | -0.256 |
| 0.8541666666666666 | -0.256 |
| 0.8548611111111111 | -0.256 |
| 0.8555555555555556 | -0.256 |
| 0.8562500000000001 | -0.256 |
| 0.8569444444444444 | -0.256 |
| 0.8576388888888888 | -0.256 |
| 0.8583333333333334 | -0.256 |
| 0.8590277777777778 | -0.256 |
| 0.8597222222222222 | -0.256 |
| 0.8604166666666666 | -0.256 |
| 0.8611111111111112 | -0.256 |
| 0.8618055555555556 | -0.256 |
| 0.8624999999999999 | -0.256 |
| 0.8631944444444444 | -0.256 |
| 0.8638888888888889 | -0.256 |
| 0.8645833333333334 | -0.256 |
| 0.8652777777777777 | -0.256 |
| 0.8659722222222223 | -0.256 |
| 0.8666666666666667 | -0.256 |
| 0.8673611111111111 | -0.256 |
| 0.8680555555555555 | -0.256 |
| 0.86875 | -0.256 |
| 0.8694444444444445 | -0.256 |
| 0.8701388888888889 | -0.256 |
| 0.8708333333333332 | -0.256 |
| 0.8715277777777778 | -0.256 |
| 0.8722222222222222 | -0.256 |
| 0.8729166666666667 | -0.256 |
| 0.873611111111111 | -0.256 |
| 0.8743055555555556 | -0.256 |
| 0.875 | -0.256 |
| 0.8756944444444444 | -0.256 |
| 0.876388888888889 | -0.256 |
| 0.8770833333333333 | -0.256 |
| 0.8777777777777778 | -0.256 |
| 0.8784722222222222 | -0.256 |
| 0.8791666666666668 | -0.256 |
| 0.8798611111111111 | -0.256 |
| 0.8805555555555555 | -0.256 |
| 0.88125 | -0.256 |
| 0.8819444444444445 | -0.256 |
| 0.8826388888888889 | -0.256 |
| 0.8833333333333333 | -0.256 |
| 0.8840277777777777 | -0.256 |
| 0.8847222222222223 | -0.256 |
| 0.8854166666666666 | -0.256 |
| 0.8861111111111111 | -0.256 |
| 0.8868055555555556 | -0.256 |
| 0.8875000000000001 | -0.256 |
| 0.8881944444444444 | -0.256 |
| 0.8888888888888888 | -0.256 |
| 0.8895833333333334 | -0.256 |
| 0.8902777777777778 | -0.256 |
| 0.8909722222222222 | -0.256 |
| 0.8916666666666666 | -0.256 |
| 0.8923611111111112 | -0.256 |
| 0.8930555555555556 | -0.256 |
| 0.8937499999999999 | -0.256 |
| 0.8944444444444444 | -0.256 |
| 0.8951388888888889 | -0.256 |
| 0.8958333333333334 | -0.256 |
| 0.8965277777777777 | -0.256 |
| 0.8972222222222223 | -0.256 |
| 0.8979166666666667 | -0.256 |
| 0.8986111111111111 | -0.256 |
| 0.8993055555555555 | -0.256 |
| 0.9 | -0.256 |
| 0.9006944444444445 | -0.256 |
| 0.9013888888888889 | -0.256 |
| 0.9020833333333332 | -0.256 |
| 0.9027777777777778 | -0.256 |
| 0.9034722222222222 | -0.256 |
| 0.9041666666666667 | -0.256 |
| 0.904861111111111 | -0.256 |
| 0.9055555555555556 | -0.256 |
| 0.90625 | -0.256 |
| 0.9069444444444444 | -0.256 |
| 0.907638888888889 | -0.256 |
| 0.9083333333333333 | -0.256 |
| 0.9090277777777778 | -0.256 |
| 0.9097222222222222 | -0.256 |
| 0.9104166666666668 | -0.256 |
| 0.9111111111111111 | -0.256 |
| 0.9118055555555555 | -0.256 |
| 0.9125 | -0.256 |
| 0.9131944444444445 | -0.256 |
| 0.9138888888888889 | -0.256 |
| 0.9145833333333333 | -0.256 |
| 0.9152777777777777 | -0.256 |
| 0.9159722222222223 | -0.256 |
| 0.9166666666666666 | -0.256 |
| 0.9173611111111111 | -0.256 |
| 0.9180555555555556 | -0.256 |
| 0.9187500000000001 | -0.256 |
| 0.9194444444444444 | -0.256 |
| 0.9201388888888888 | -0.256 |
| 0.9208333333333334 | -0.256 |
| 0.9215277777777778 | -0.256 |
| 0.9222222222222222 | -0.256 |
| 0.9229166666666666 | -0.256 |
| 0.9236111111111112 | -0.256 |
| 0.9243055555555556 | -0.256 |
| 0.9249999999999999 | -0.256 |
| 0.9256944444444444 | -0.256 |
| 0.9263888888888889 | -0.256 |
| 0.9270833333333334 | -0.256 |
| 0.9277777777777777 | -0.256 |
| 0.9284722222222223 | -0.256 |
| 0.9291666666666667 | -0.256 |
| 0.9298611111111111 | -0.256 |
| 0.9305555555555555 | -0.256 |
| 0.93125 | -0.256 |
| 0.9319444444444445 | -0.256 |
| 0.9326388888888889 | -0.256 |
| 0.9333333333333332 | -0.256 |
| 0.9340277777777778 | -0.256 |
| 0.9347222222222222 | -0.256 |
| 0.9354166666666667 | -0.256 |
| 0.936111111111111 | -0.256 |
| 0.9368055555555556 | -0.256 |
| 0.9375 | -0.256 |
| 0.9381944444444444 | -0.256 |
| 0.938888888888889 | -0.256 |
| 0.9395833333333333 | -0.256 |
| 0.9402777777777778 | -0.256 |
| 0.9409722222222222 | -0.256 |
| 0.9416666666666668 | -0.256 |
| 0.9423611111111111 | -0.256 |
| 0.9430555555555555 | -0.256 |
| 0.94375 | -0.256 |
| 0.9444444444444445 | -0.256 |
| 0.9451388888888889 | -0.256 |
| 0.9458333333333333 | -0.256 |
| 0.9465277777777777 | -0.256 |
| 0.9472222222222223 | -0.256 |
| 0.9479166666666666 | -0.256 |
| 0.9486111111111111 | -0.256 |
| 0.9493055555555556 | -0.256 |
| 0.9500000000000001 | -0.256 |
| 0.9506944444444444 | -0.256 |
| 0.9513888888888888 | -0.256 |
| 0.9520833333333334 | -0.256 |
| 0.9527777777777778 | -0.256 |
| 0.9534722222222222 | -0.256 |
| 0.9541666666666666 | -0.256 |
| 0.9548611111111112 | -0.256 |
| 0.9555555555555556 | -0.256 |
| 0.9562499999999999 | -0.256 |
| 0.9569444444444444 | -0.256 |
| 0.9576388888888889 | -0.256 |
| 0.9583333333333334 | -0.256 |
| 0.9590277777777777 | -0.256 |
| 0.9597222222222223 | -0.256 |
| 0.9604166666666667 | -0.256 |
| 0.9611111111111111 | -0.256 |
| 0.9618055555555555 | -0.256 |
| 0.9625 | -0.256 |
| 0.9631944444444445 | -0.256 |
| 0.9638888888888889 | -0.256 |
| 0.9645833333333332 | -0.256 |
| 0.9652777777777778 | -0.256 |
| 0.9659722222222222 | -0.256 |
| 0.9666666666666667 | -0.256 |
| 0.967361111111111 | -0.256 |
| 0.9680555555555556 | -0.256 |
| 0.96875 | -0.256 |
| 0.9694444444444444 | -0.256 |
| 0.970138888888889 | -0.256 |
| 0.9708333333333333 | -0.256 |
| 0.9715277777777778 | -0.256 |
| 0.9722222222222222 | -0.256 |
| 0.9729166666666668 | -0.256 |
| 0.9736111111111111 | -0.256 |
| 0.9743055555555555 | -0.256 |
| 0.975 | -0.256 |
| 0.9756944444444445 | -0.256 |
| 0.9763888888888889 | -0.256 |
| 0.9770833333333333 | -0.256 |
| 0.9777777777777777 | -0.256 |
| 0.9784722222222223 | -0.256 |
| 0.9791666666666666 | -0.256 |
| 0.9798611111111111 | -0.256 |
| 0.9805555555555556 | -0.256 |
| 0.9812500000000001 | -0.256 |
| 0.9819444444444444 | -0.256 |
| 0.9826388888888888 | -0.256 |
| 0.9833333333333334 | -0.256 |
| 0.9840277777777778 | -0.256 |
| 0.9847222222222222 | -0.256 |
| 0.9854166666666666 | -0.256 |
| 0.9861111111111112 | -0.256 |
| 0.9868055555555556 | -0.256 |
| 0.9874999999999999 | -0.256 |
| 0.9881944444444444 | -0.256 |
| 0.9888888888888889 | -0.256 |
| 0.9895833333333334 | -0.256 |
| 0.9902777777777777 | -0.256 |
| 0.9909722222222223 | -0.256 |
| 0.9916666666666667 | -0.256 |
| 0.9923611111111111 | -0.256 |
| 0.9930555555555555 | -0.256 |
| 0.99375 | -0.256 |
| 0.9944444444444445 | -0.256 |
| 0.9951388888888889 | -0.256 |
| 0.9958333333333332 | -0.256 |
| 0.9965277777777778 | -0.256 |
| 0.9972222222222222 | -0.256 |
| 0.9979166666666667 | -0.256 |
| 0.998611111111111 | -0.256 |
| 0.9993055555555556 | 0 |